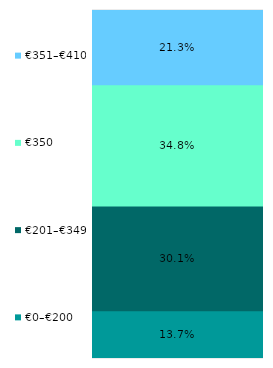
| Category | €0–€200 | €201–€349 | €350 | €351–€410 |
|---|---|---|---|---|
| 0 | 0.137 | 0.301 | 0.348 | 0.213 |